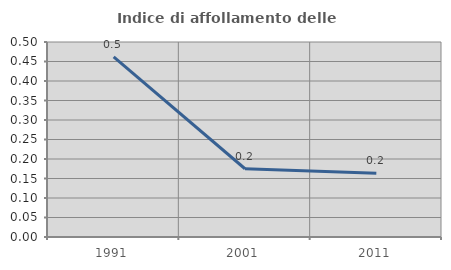
| Category | Indice di affollamento delle abitazioni  |
|---|---|
| 1991.0 | 0.462 |
| 2001.0 | 0.175 |
| 2011.0 | 0.163 |